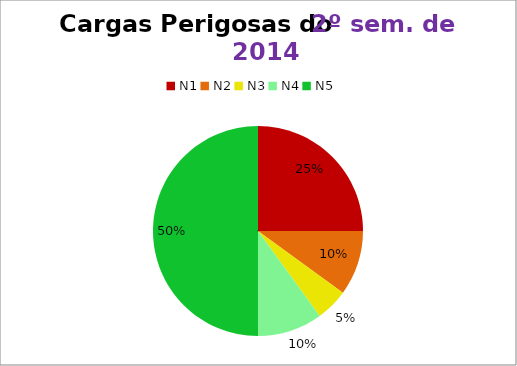
| Category | 2º/14 |
|---|---|
| N1 | 5 |
| N2 | 2 |
| N3 | 1 |
| N4 | 2 |
| N5 | 10 |